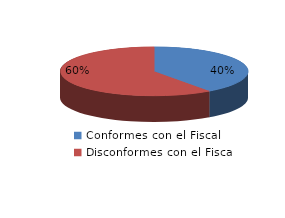
| Category | Series 0 |
|---|---|
| 0 | 34 |
| 1 | 51 |